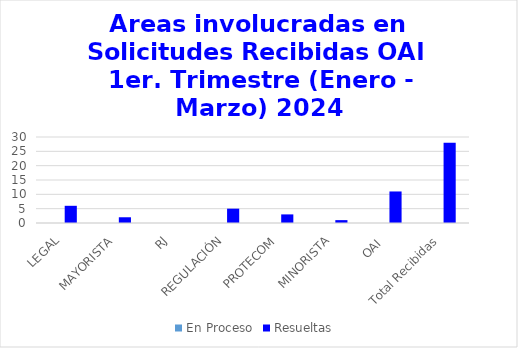
| Category | En Proceso | Resueltas  |
|---|---|---|
| LEGAL | 0 | 6 |
| MAYORISTA | 0 | 2 |
| RJ | 0 | 0 |
| REGULACIÓN | 0 | 5 |
| PROTECOM | 0 | 3 |
| MINORISTA | 0 | 1 |
| OAI  | 0 | 11 |
| Total Recibidas | 0 | 28 |